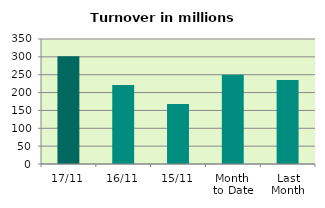
| Category | Series 0 |
|---|---|
| 17/11 | 301.776 |
| 16/11 | 221.299 |
| 15/11 | 168.054 |
| Month 
to Date | 249.75 |
| Last
Month | 235.36 |